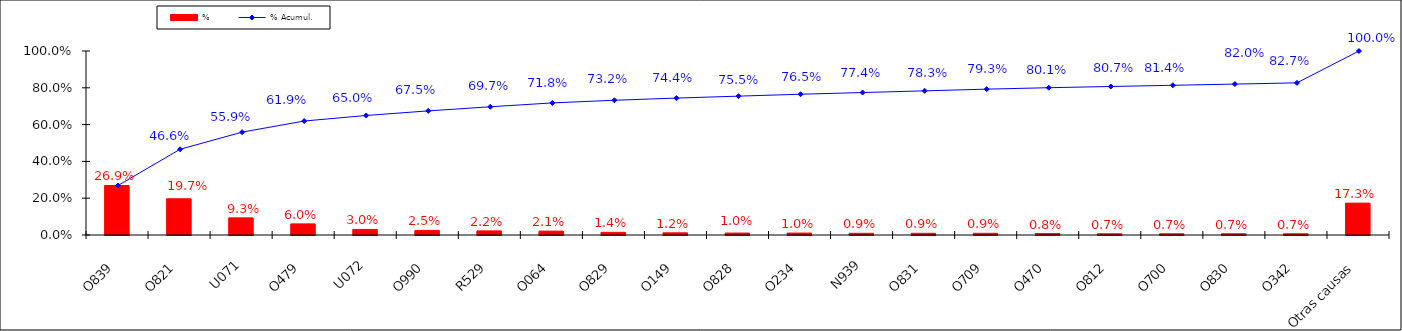
| Category | % |
|---|---|
| O839 | 0.269 |
| O821 | 0.197 |
| U071 | 0.093 |
| O479 | 0.06 |
| U072 | 0.03 |
| O990 | 0.025 |
| R529 | 0.022 |
| O064 | 0.021 |
| O829 | 0.014 |
| O149 | 0.012 |
| O828 | 0.01 |
| O234 | 0.01 |
| N939 | 0.009 |
| O831 | 0.009 |
| O709 | 0.009 |
| O470 | 0.008 |
| O812 | 0.007 |
| O700 | 0.007 |
| O830 | 0.007 |
| O342 | 0.007 |
| Otras causas | 0.173 |